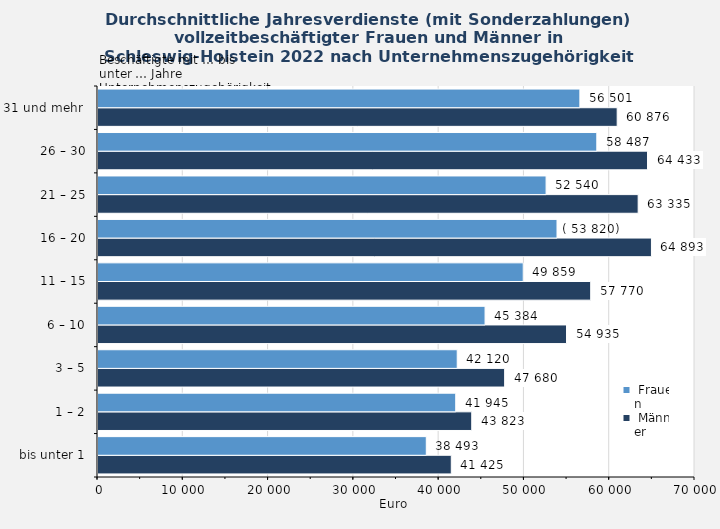
| Category |  Männer |  Frauen |
|---|---|---|
| bis unter 1 | 41425 | 38493 |
| 1 – 2 | 43823 | 41945 |
| 3 – 5 | 47680 | 42120 |
| 6 – 10 | 54935 | 45384 |
| 11 – 15 | 57770 | 49859 |
| 16 – 20 | 64893 | 53820 |
| 21 – 25 | 63335 | 52540 |
| 26 – 30 | 64433 | 58487 |
| 31 und mehr  | 60876 | 56501 |